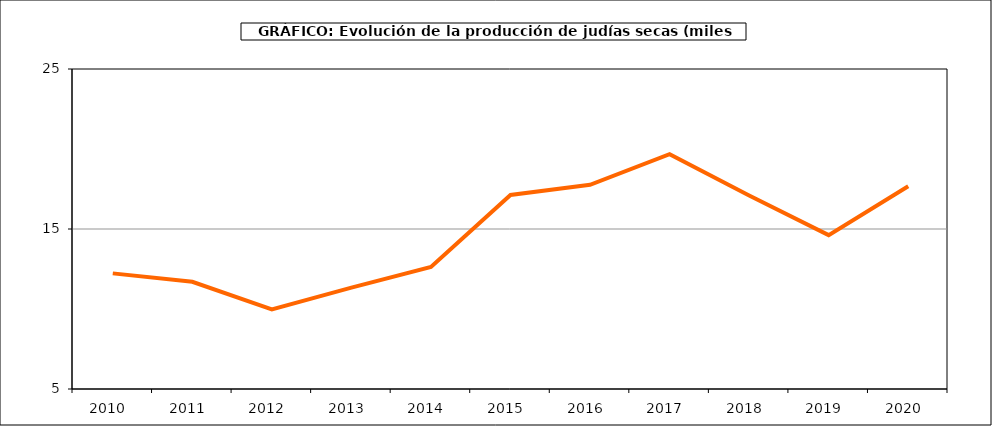
| Category | Superficie |
|---|---|
| 2010.0 | 12.226 |
| 2011.0 | 11.701 |
| 2012.0 | 9.971 |
| 2013.0 | 11.337 |
| 2014.0 | 12.629 |
| 2015.0 | 17.125 |
| 2016.0 | 17.761 |
| 2017.0 | 19.675 |
| 2018.0 | 17.091 |
| 2019.0 | 14.615 |
| 2020.0 | 17.671 |